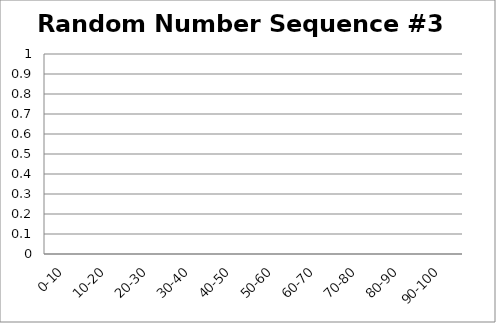
| Category | Random Number Sequence #3 |
|---|---|
| 0-10 | 0 |
| 10-20 | 0 |
| 20-30 | 0 |
| 30-40 | 0 |
| 40-50 | 0 |
| 50-60 | 0 |
| 60-70 | 0 |
| 70-80 | 0 |
| 80-90 | 0 |
| 90-100 | 0 |